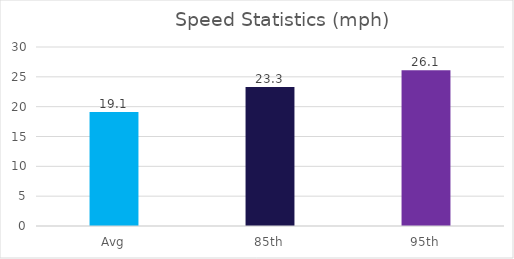
| Category | Series 0 |
|---|---|
| Avg | 19.1 |
| 85th | 23.3 |
| 95th | 26.1 |